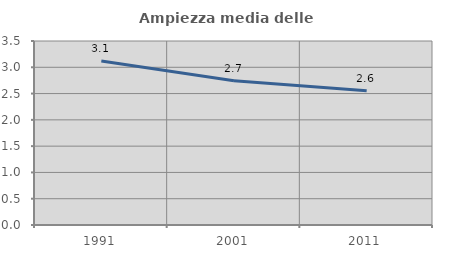
| Category | Ampiezza media delle famiglie |
|---|---|
| 1991.0 | 3.12 |
| 2001.0 | 2.743 |
| 2011.0 | 2.552 |